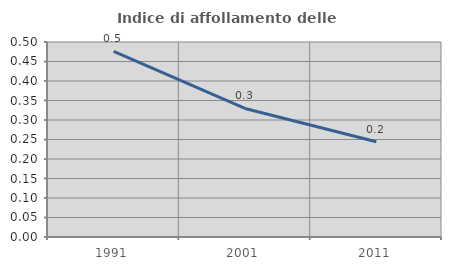
| Category | Indice di affollamento delle abitazioni  |
|---|---|
| 1991.0 | 0.476 |
| 2001.0 | 0.33 |
| 2011.0 | 0.244 |